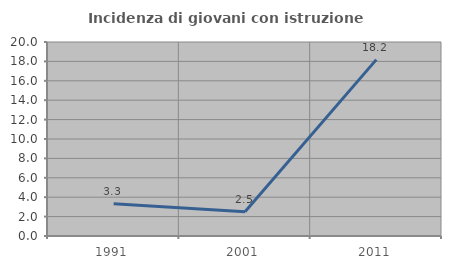
| Category | Incidenza di giovani con istruzione universitaria |
|---|---|
| 1991.0 | 3.333 |
| 2001.0 | 2.5 |
| 2011.0 | 18.182 |